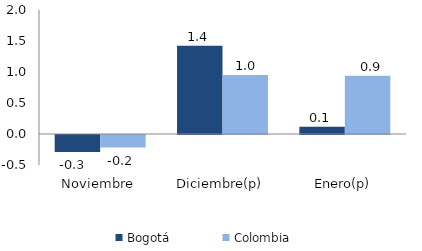
| Category | Bogotá | Colombia |
|---|---|---|
| Noviembre | -0.273 | -0.204 |
| Diciembre(p) | 1.424 | 0.953 |
| Enero(p) | 0.118 | 0.939 |